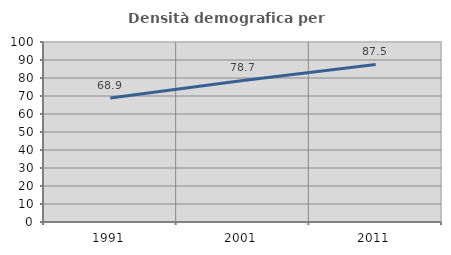
| Category | Densità demografica |
|---|---|
| 1991.0 | 68.93 |
| 2001.0 | 78.657 |
| 2011.0 | 87.546 |